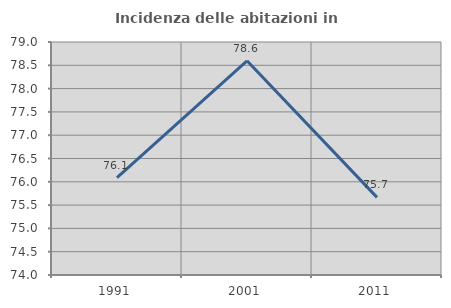
| Category | Incidenza delle abitazioni in proprietà  |
|---|---|
| 1991.0 | 76.092 |
| 2001.0 | 78.597 |
| 2011.0 | 75.666 |